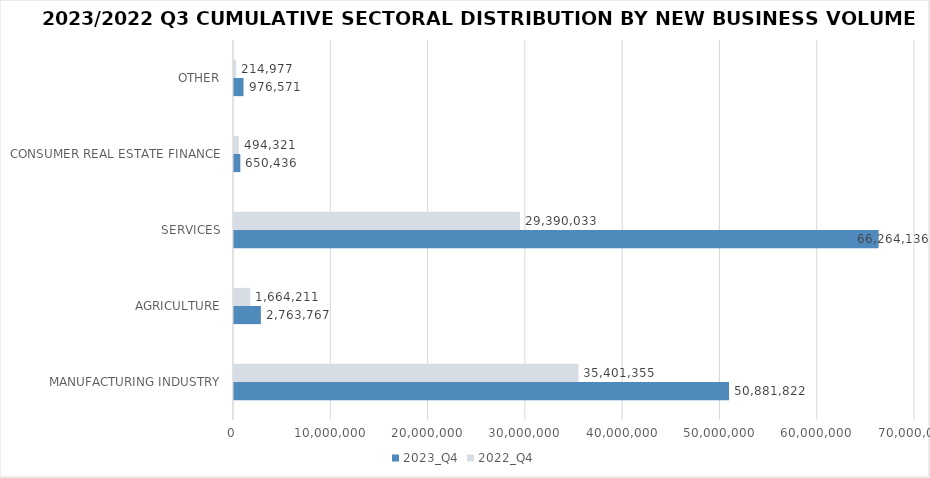
| Category | 2023_Q4 | 2022_Q4 |
|---|---|---|
| MANUFACTURING INDUSTRY | 50881821.686 | 35401354.619 |
| AGRICULTURE | 2763767.331 | 1664211.191 |
| SERVICES | 66264136.217 | 29390032.677 |
| CONSUMER REAL ESTATE FINANCE | 650436 | 494321 |
| OTHER | 976571 | 214977 |